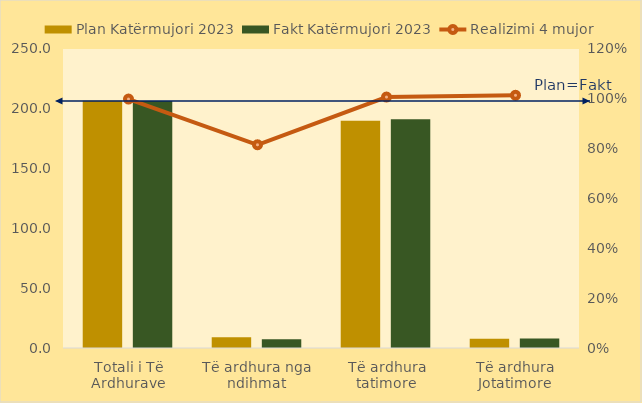
| Category | Plan Katërmujori 2023 | Fakt Katërmujori 2023 |
|---|---|---|
| Totali i Të Ardhurave | 206.678 | 206.498 |
| Të ardhura nga ndihmat | 9.005 | 7.345 |
| Të ardhura tatimore | 189.92 | 191.289 |
| Të ardhura Jotatimore | 7.753 | 7.863 |